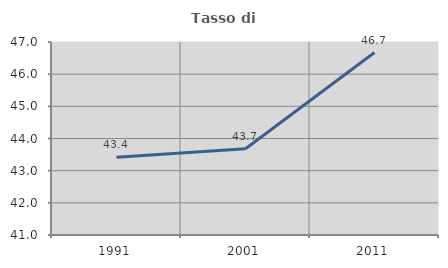
| Category | Tasso di occupazione   |
|---|---|
| 1991.0 | 43.418 |
| 2001.0 | 43.683 |
| 2011.0 | 46.671 |